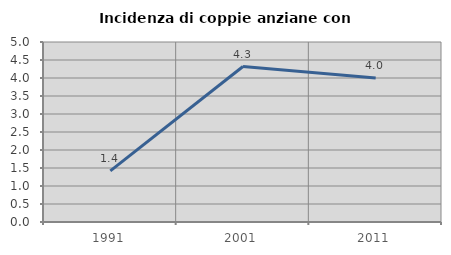
| Category | Incidenza di coppie anziane con figli |
|---|---|
| 1991.0 | 1.418 |
| 2001.0 | 4.318 |
| 2011.0 | 4 |